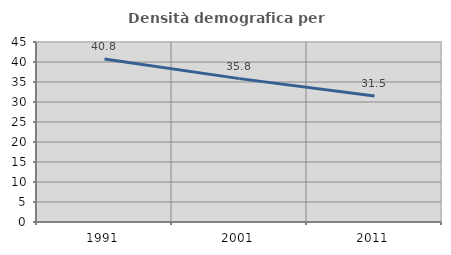
| Category | Densità demografica |
|---|---|
| 1991.0 | 40.769 |
| 2001.0 | 35.845 |
| 2011.0 | 31.485 |